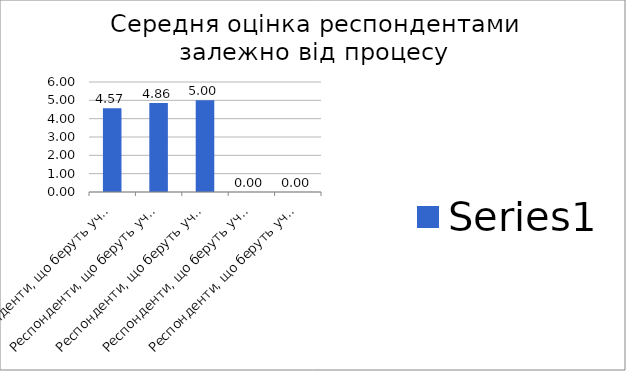
| Category | Series 0 |
|---|---|
| Респонденти, що беруть участь у цивільних справах | 4.571 |
| Респонденти, що беруть участь у кримінальних справах | 4.857 |
| Респонденти, що беруть участь у адміністративних справах | 5 |
| Респонденти, що беруть участь у господарських справах | 0 |
| Респонденти, що беруть участь у справах про адміністративні правопорушення | 0 |